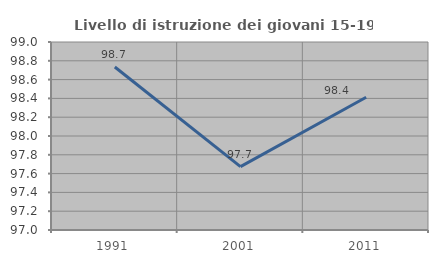
| Category | Livello di istruzione dei giovani 15-19 anni |
|---|---|
| 1991.0 | 98.734 |
| 2001.0 | 97.674 |
| 2011.0 | 98.413 |